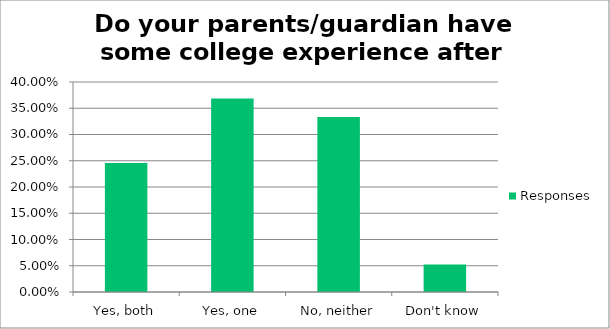
| Category | Responses |
|---|---|
| Yes, both | 0.246 |
| Yes, one | 0.368 |
| No, neither | 0.333 |
| Don't know | 0.053 |